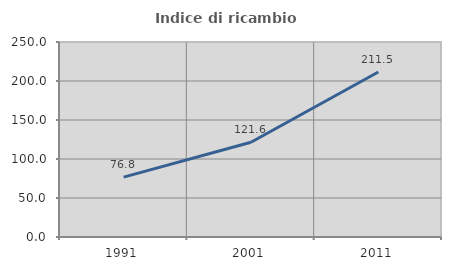
| Category | Indice di ricambio occupazionale  |
|---|---|
| 1991.0 | 76.822 |
| 2001.0 | 121.552 |
| 2011.0 | 211.522 |